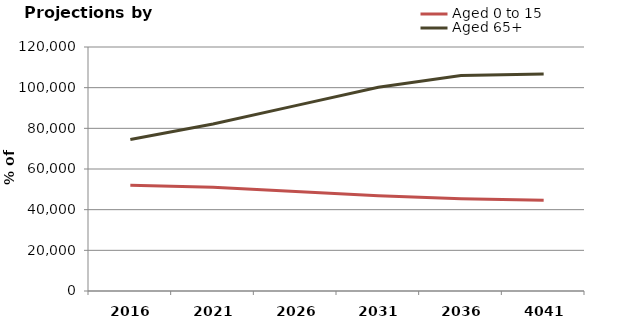
| Category | Aged 0 to 15 | Aged 65+ |
|---|---|---|
| 2016.0 | 51981 | 74529 |
| 2021.0 | 51039.765 | 82095.204 |
| 2026.0 | 48956.596 | 91155.335 |
| 2031.0 | 46812.148 | 100217.02 |
| 2036.0 | 45372.289 | 105924.7 |
| 4041.0 | 44622.005 | 106715.588 |